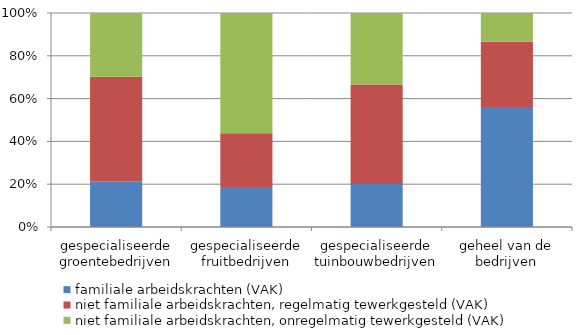
| Category | familiale arbeidskrachten (VAK) | niet familiale arbeidskrachten, regelmatig tewerkgesteld (VAK) | niet familiale arbeidskrachten, onregelmatig tewerkgesteld (VAK) |
|---|---|---|---|
| gespecialiseerde groentebedrijven | 1188 | 2716.75 | 1661.23 |
| gespecialiseerde fruitbedrijven | 725 | 975.13 | 2183.76 |
| gespecialiseerde tuinbouwbedrijven | 2694.13 | 6212.26 | 4479.43 |
| geheel van de bedrijven | 22042.63 | 12010.25 | 5262.07 |